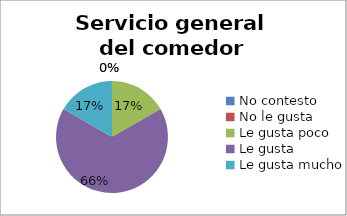
| Category | Series 0 |
|---|---|
| No contesto | 0 |
| No le gusta | 0 |
| Le gusta poco | 1 |
| Le gusta | 4 |
| Le gusta mucho | 1 |